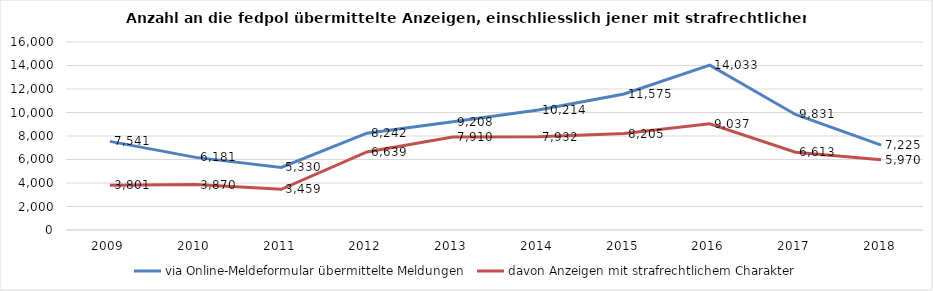
| Category | via Online-Meldeformular übermittelte Meldungen | davon Anzeigen mit strafrechtlichem Charakter |
|---|---|---|
| 2009.0 | 7541 | 3801 |
| 2010.0 | 6181 | 3870 |
| 2011.0 | 5330 | 3459 |
| 2012.0 | 8242 | 6639 |
| 2013.0 | 9208 | 7910 |
| 2014.0 | 10214 | 7932 |
| 2015.0 | 11575 | 8205 |
| 2016.0 | 14033 | 9037 |
| 2017.0 | 9831 | 6613 |
| 2018.0 | 7225 | 5970 |